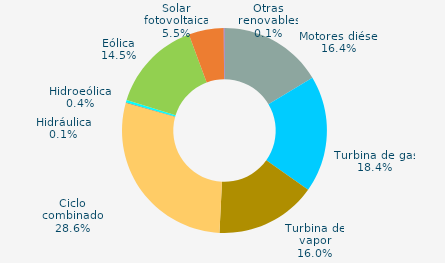
| Category | Series 0 |
|---|---|
| Motores diésel | 16.399 |
| Turbina de gas | 18.424 |
| Turbina de vapor | 15.96 |
| Ciclo combinado | 28.578 |
| Cogeneración | 0 |
| Hidráulica | 0.067 |
| Hidroeólica | 0.377 |
| Eólica | 14.547 |
| Solar fotovoltaica | 5.526 |
| Otras renovables | 0.122 |